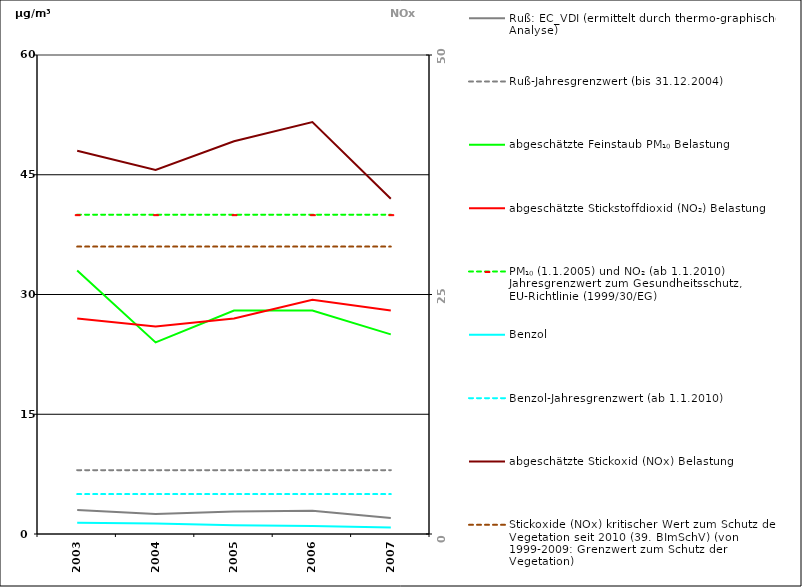
| Category | Ruß: EC_VDI (ermittelt durch thermo-graphische Analyse) | Ruß-Jahresgrenzwert (bis 31.12.2004) | abgeschätzte Feinstaub PM₁₀ Belastung | abgeschätzte Stickstoffdioxid (NO₂) Belastung | PM₁₀ (1.1.2005) und NO₂ (ab 1.1.2010) Jahresgrenzwert zum Gesundheitsschutz, EU-Richtlinie (1999/30/EG) | Benzol | Benzol-Jahresgrenzwert (ab 1.1.2010) |
|---|---|---|---|---|---|---|---|
| 2003.0 | 3 | 8 | 33 | 27 | 40 | 1.4 | 5 |
| 2004.0 | 2.5 | 8 | 24 | 26 | 40 | 1.3 | 5 |
| 2005.0 | 2.81 | 8 | 28 | 27 | 40 | 1.1 | 5 |
| 2006.0 | 2.91 | 8 | 28 | 29.34 | 40 | 1 | 5 |
| 2007.0 | 2 | 8 | 25 | 28 | 40 | 0.8 | 5 |